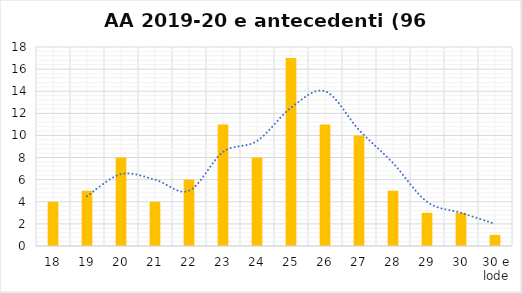
| Category | Series 0 |
|---|---|
| 18 | 4 |
| 19 | 5 |
| 20 | 8 |
| 21 | 4 |
| 22 | 6 |
| 23 | 11 |
| 24 | 8 |
| 25 | 17 |
| 26 | 11 |
| 27 | 10 |
| 28 | 5 |
| 29 | 3 |
| 30 | 3 |
| 30 e lode | 1 |